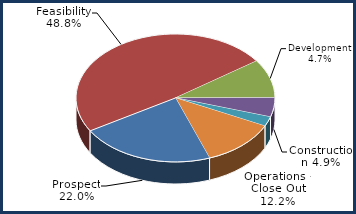
| Category | Series 0 |
|---|---|
| Prospect | 0.22 |
| Feasibility | 0.488 |
| Development | 0.098 |
| Construction | 0.049 |
| Operations - Lease Up | 0.024 |
| Operations - Close Out | 0.122 |